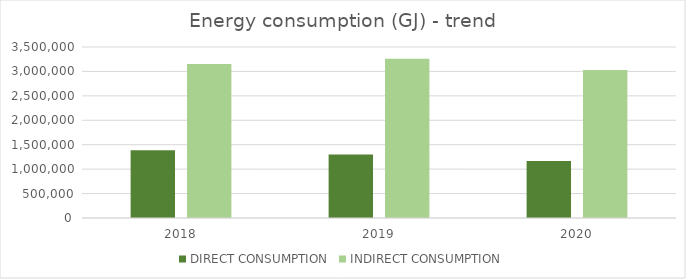
| Category | DIRECT CONSUMPTION | INDIRECT CONSUMPTION |
|---|---|---|
| 2018.0 | 1385284 | 3151771 |
| 2019.0 | 1300475 | 3258755 |
| 2020.0 | 1169096 | 3029482 |